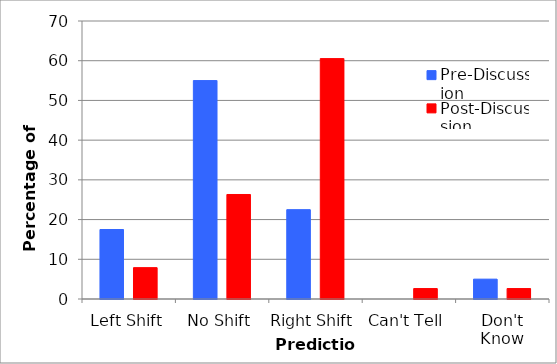
| Category | Pre-Discussion | Post-Discussion |
|---|---|---|
| Left Shift | 17.5 | 7.895 |
| No Shift | 55 | 26.316 |
| Right Shift | 22.5 | 60.526 |
| Can't Tell | 0 | 2.632 |
| Don't Know | 5 | 2.632 |